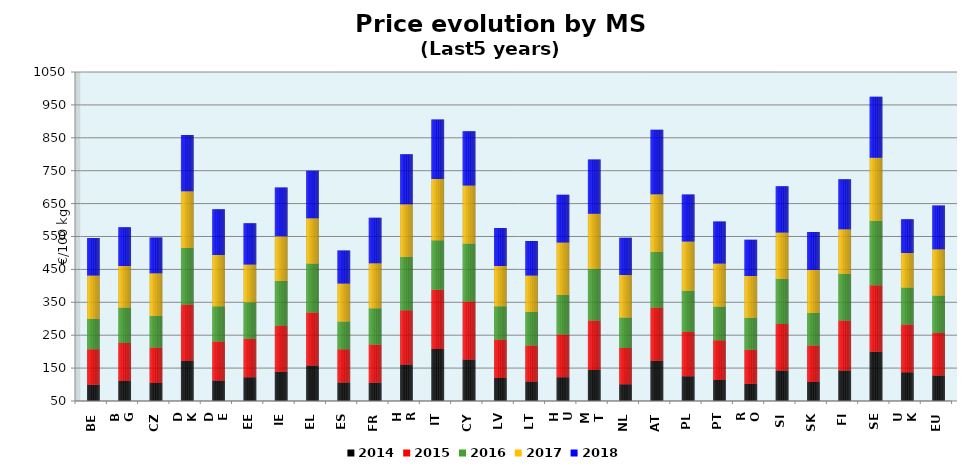
| Category | 2014 | 2015 | 2016 | 2017 | 2018 |
|---|---|---|---|---|---|
| BE | 99.206 | 108.069 | 92.722 | 131.224 | 114.058 |
| BG | 110.734 | 115.638 | 107.636 | 126.407 | 118.035 |
| CZ | 104.375 | 107.863 | 95.755 | 130.247 | 108.4 |
| DK | 171.699 | 171.607 | 171.968 | 172.069 | 171.198 |
| DE | 111.951 | 118.656 | 107.471 | 155.727 | 138.66 |
| EE | 122.339 | 116.648 | 111.047 | 115.044 | 125.254 |
| IE | 138.967 | 138.597 | 137.353 | 136.125 | 148.233 |
| EL | 158.217 | 160.996 | 148.881 | 137.751 | 144.391 |
| ES | 106.254 | 101.066 | 83.914 | 115.536 | 100.809 |
| FR | 105.643 | 116.018 | 110.06 | 137.249 | 138.016 |
| HR | 161.039 | 164.559 | 162.292 | 159.958 | 152.229 |
| IT | 208.084 | 180.182 | 149.98 | 186.507 | 180.842 |
| CY | 176.153 | 176.173 | 176.144 | 176.41 | 165.315 |
| LV | 120.044 | 116.805 | 101.361 | 122.129 | 115.34 |
| LT | 109.092 | 109.287 | 102.444 | 110.888 | 104.412 |
| HU | 122.392 | 129.47 | 120.258 | 159.967 | 145.013 |
| MT | 144.098 | 150.393 | 157.331 | 167.334 | 165.132 |
| NL | 100.832 | 109.929 | 93.075 | 129.048 | 113.128 |
| AT | 172.264 | 161.558 | 168.708 | 175.726 | 196.551 |
| PL | 125.027 | 134.515 | 125.747 | 149.807 | 142.755 |
| PT | 114.067 | 120.493 | 102.688 | 130.915 | 127.381 |
| RO | 102.693 | 102.776 | 97.232 | 127.259 | 110.445 |
| SI | 142.742 | 141.411 | 137.067 | 141.065 | 140.603 |
| SK | 107.552 | 110.906 | 98.946 | 130.453 | 116.18 |
| FI | 142.875 | 151.903 | 141.892 | 135.581 | 151.446 |
| SE | 199.593 | 202.452 | 195.802 | 191.304 | 185.382 |
| UK | 137.527 | 145.22 | 112.585 | 104.431 | 102.597 |
| EU | 127.567 | 128.883 | 113.832 | 140.921 | 132.671 |